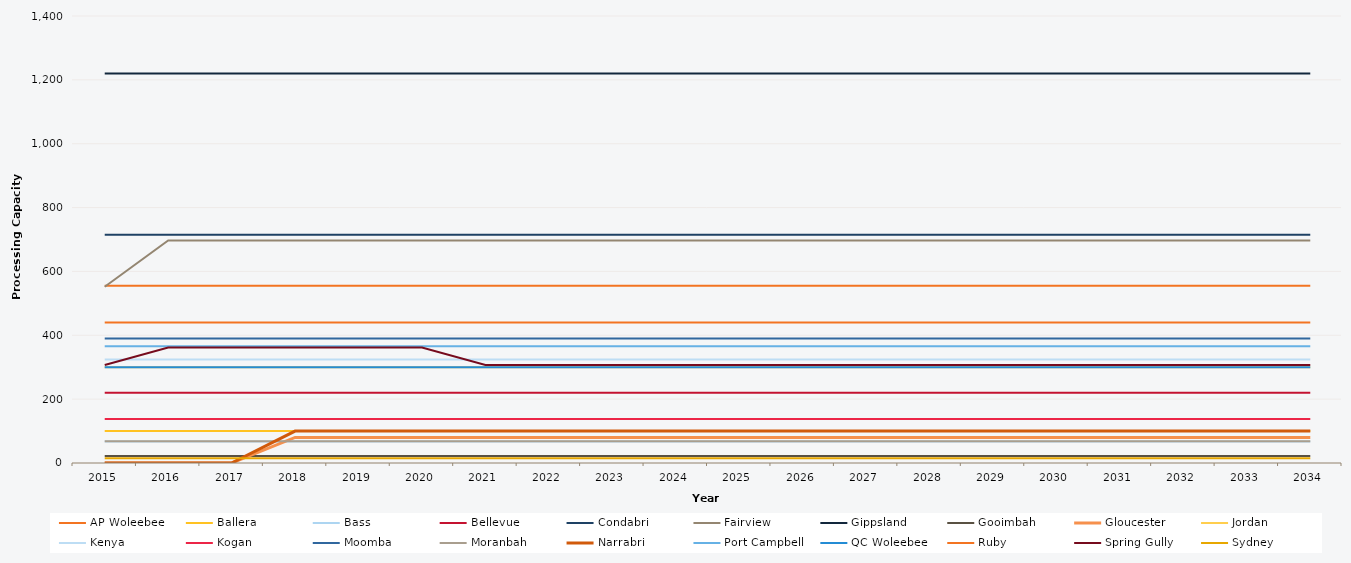
| Category | AP Woleebee | Ballera | Bass | Bellevue | Condabri | Fairview | Gippsland | Gooimbah | Gloucester | Jordan | Kenya | Kogan | Moomba | Moranbah | Narrabri | Port Campbell | QC Woleebee | Ruby | Spring Gully | Sydney |
|---|---|---|---|---|---|---|---|---|---|---|---|---|---|---|---|---|---|---|---|---|
| 2015.0 | 555 | 100 | 67 | 220 | 715 | 552 | 1220 | 22 | 0 | 300 | 324 | 138 | 390 | 68 | 0 | 366 | 300 | 440 | 307 | 15 |
| 2016.0 | 555 | 100 | 67 | 220 | 715 | 697 | 1220 | 22 | 0 | 300 | 324 | 138 | 390 | 68 | 0 | 366 | 300 | 440 | 362 | 15 |
| 2017.0 | 555 | 100 | 67 | 220 | 715 | 697 | 1220 | 22 | 0 | 300 | 324 | 138 | 390 | 68 | 0 | 366 | 300 | 440 | 362 | 15 |
| 2018.0 | 555 | 100 | 67 | 220 | 715 | 697 | 1220 | 22 | 80 | 300 | 324 | 138 | 390 | 68 | 100 | 366 | 300 | 440 | 362 | 15 |
| 2019.0 | 555 | 100 | 67 | 220 | 715 | 697 | 1220 | 22 | 80 | 300 | 324 | 138 | 390 | 68 | 100 | 366 | 300 | 440 | 362 | 15 |
| 2020.0 | 555 | 100 | 67 | 220 | 715 | 697 | 1220 | 22 | 80 | 300 | 324 | 138 | 390 | 68 | 100 | 366 | 300 | 440 | 362 | 15 |
| 2021.0 | 555 | 100 | 67 | 220 | 715 | 697 | 1220 | 22 | 80 | 300 | 324 | 138 | 390 | 68 | 100 | 366 | 300 | 440 | 307 | 15 |
| 2022.0 | 555 | 100 | 67 | 220 | 715 | 697 | 1220 | 22 | 80 | 300 | 324 | 138 | 390 | 68 | 100 | 366 | 300 | 440 | 307 | 15 |
| 2023.0 | 555 | 100 | 67 | 220 | 715 | 697 | 1220 | 22 | 80 | 300 | 324 | 138 | 390 | 68 | 100 | 366 | 300 | 440 | 307 | 15 |
| 2024.0 | 555 | 100 | 67 | 220 | 715 | 697 | 1220 | 22 | 80 | 300 | 324 | 138 | 390 | 68 | 100 | 366 | 300 | 440 | 307 | 15 |
| 2025.0 | 555 | 100 | 67 | 220 | 715 | 697 | 1220 | 22 | 80 | 300 | 324 | 138 | 390 | 68 | 100 | 366 | 300 | 440 | 307 | 15 |
| 2026.0 | 555 | 100 | 67 | 220 | 715 | 697 | 1220 | 22 | 80 | 300 | 324 | 138 | 390 | 68 | 100 | 366 | 300 | 440 | 307 | 15 |
| 2027.0 | 555 | 100 | 67 | 220 | 715 | 697 | 1220 | 22 | 80 | 300 | 324 | 138 | 390 | 68 | 100 | 366 | 300 | 440 | 307 | 15 |
| 2028.0 | 555 | 100 | 67 | 220 | 715 | 697 | 1220 | 22 | 80 | 300 | 324 | 138 | 390 | 68 | 100 | 366 | 300 | 440 | 307 | 15 |
| 2029.0 | 555 | 100 | 67 | 220 | 715 | 697 | 1220 | 22 | 80 | 300 | 324 | 138 | 390 | 68 | 100 | 366 | 300 | 440 | 307 | 15 |
| 2030.0 | 555 | 100 | 67 | 220 | 715 | 697 | 1220 | 22 | 80 | 300 | 324 | 138 | 390 | 68 | 100 | 366 | 300 | 440 | 307 | 15 |
| 2031.0 | 555 | 100 | 67 | 220 | 715 | 697 | 1220 | 22 | 80 | 300 | 324 | 138 | 390 | 68 | 100 | 366 | 300 | 440 | 307 | 15 |
| 2032.0 | 555 | 100 | 67 | 220 | 715 | 697 | 1220 | 22 | 80 | 300 | 324 | 138 | 390 | 68 | 100 | 366 | 300 | 440 | 307 | 15 |
| 2033.0 | 555 | 100 | 67 | 220 | 715 | 697 | 1220 | 22 | 80 | 300 | 324 | 138 | 390 | 68 | 100 | 366 | 300 | 440 | 307 | 15 |
| 2034.0 | 555 | 100 | 67 | 220 | 715 | 697 | 1220 | 22 | 80 | 300 | 324 | 138 | 390 | 68 | 100 | 366 | 300 | 440 | 307 | 15 |